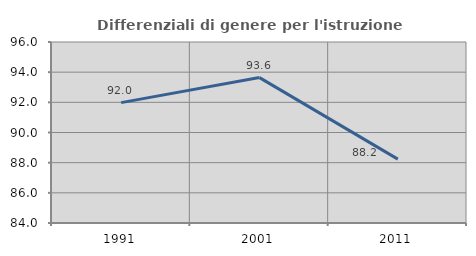
| Category | Differenziali di genere per l'istruzione superiore |
|---|---|
| 1991.0 | 91.981 |
| 2001.0 | 93.64 |
| 2011.0 | 88.237 |